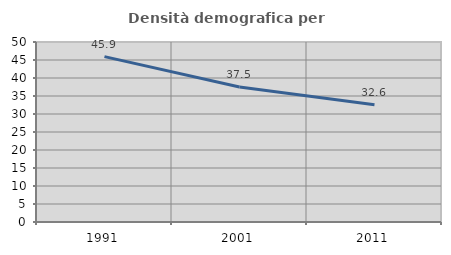
| Category | Densità demografica |
|---|---|
| 1991.0 | 45.937 |
| 2001.0 | 37.48 |
| 2011.0 | 32.554 |